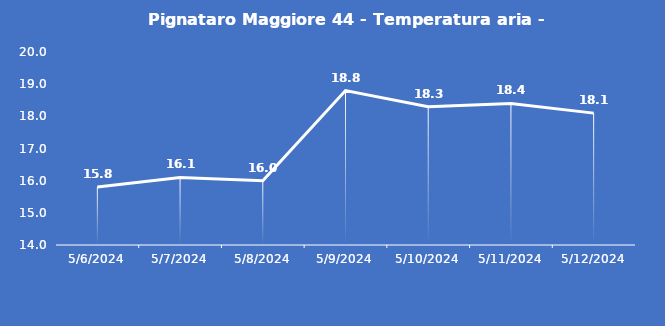
| Category | Pignataro Maggiore 44 - Temperatura aria - Grezzo (°C) |
|---|---|
| 5/6/24 | 15.8 |
| 5/7/24 | 16.1 |
| 5/8/24 | 16 |
| 5/9/24 | 18.8 |
| 5/10/24 | 18.3 |
| 5/11/24 | 18.4 |
| 5/12/24 | 18.1 |